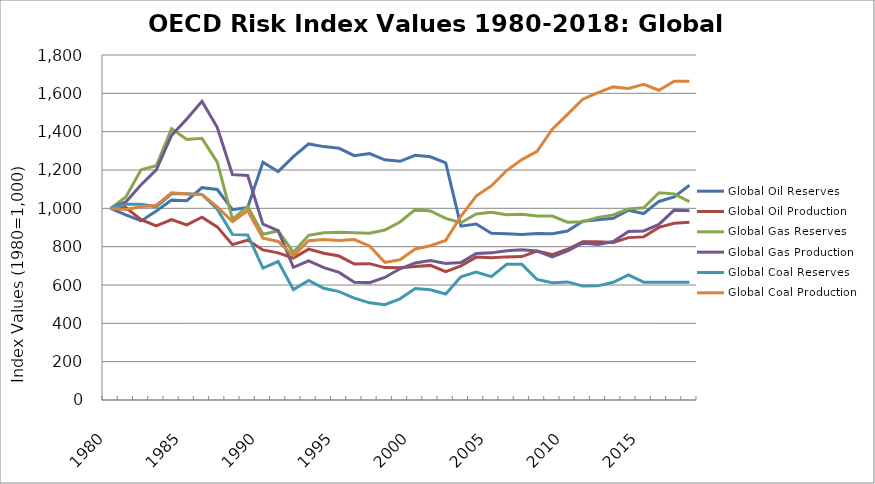
| Category | Global Oil Reserves | Global Oil Production | Global Gas Reserves | Global Gas Production | Global Coal Reserves | Global Coal Production |
|---|---|---|---|---|---|---|
| 1980.0 | 1000 | 1000 | 1000 | 1000 | 1000 | 1000 |
| 1981.0 | 965.465 | 1004.011 | 1059.522 | 1033.566 | 1021.331 | 994.49 |
| 1982.0 | 934.486 | 941.383 | 1201.635 | 1123.427 | 1021.331 | 1008.109 |
| 1983.0 | 985.373 | 908.717 | 1221.935 | 1200.305 | 1007.745 | 1016.284 |
| 1984.0 | 1043.55 | 941.789 | 1416.147 | 1380.237 | 1076.143 | 1081.565 |
| 1985.0 | 1040.004 | 913.824 | 1359.579 | 1465.555 | 1075.445 | 1074.426 |
| 1986.0 | 1107.889 | 953.785 | 1365.026 | 1557.963 | 1072.57 | 1071.979 |
| 1987.0 | 1098.24 | 903.145 | 1241.353 | 1422.864 | 995.882 | 1007.921 |
| 1988.0 | 992.666 | 810.519 | 944.158 | 1175.741 | 864.047 | 931.371 |
| 1989.0 | 1004.92 | 834.477 | 1009.152 | 1171.321 | 861.073 | 987.714 |
| 1990.0 | 1240.745 | 782.886 | 864.637 | 916.972 | 687.845 | 844.142 |
| 1991.0 | 1191.842 | 767.705 | 882.07 | 883.326 | 722.39 | 827.052 |
| 1992.0 | 1269.859 | 740.032 | 770.918 | 692.486 | 576.241 | 753.3 |
| 1993.0 | 1335.884 | 787.351 | 859.09 | 725.361 | 623.919 | 830.926 |
| 1994.0 | 1322.037 | 765.321 | 872.747 | 690.434 | 583.119 | 836.791 |
| 1995.0 | 1313.092 | 750.995 | 875.832 | 665.887 | 565.768 | 831.574 |
| 1996.0 | 1274.601 | 709.073 | 872.756 | 614.312 | 531.259 | 836.725 |
| 1997.0 | 1286.075 | 711.312 | 870.376 | 612.395 | 506.793 | 803.559 |
| 1998.0 | 1253.217 | 690.664 | 887.04 | 639.305 | 497.547 | 717.937 |
| 1999.0 | 1245.484 | 689.618 | 928.873 | 684.685 | 527.787 | 731.473 |
| 2000.0 | 1276.84 | 696.485 | 993.355 | 715.164 | 582.096 | 787.892 |
| 2001.0 | 1269.021 | 702.36 | 986.515 | 727.642 | 574.773 | 805.011 |
| 2002.0 | 1237.625 | 669.607 | 947.435 | 712.743 | 552.976 | 832.748 |
| 2003.0 | 906.84 | 699.325 | 924.915 | 717.417 | 643.121 | 958.629 |
| 2004.0 | 918.554 | 745.655 | 970.754 | 764.412 | 667.039 | 1064.311 |
| 2005.0 | 870.3 | 741.774 | 979.014 | 767.646 | 643.67 | 1117.678 |
| 2006.0 | 867.265 | 746.737 | 966.711 | 779.063 | 708.039 | 1197.207 |
| 2007.0 | 863.253 | 748.224 | 969.563 | 783.501 | 707.721 | 1254.018 |
| 2008.0 | 868.298 | 776.646 | 960.002 | 776.886 | 628.969 | 1297.494 |
| 2009.0 | 867.609 | 758.825 | 959.909 | 746.748 | 611.623 | 1413.074 |
| 2010.0 | 881.86 | 786.383 | 927.88 | 778.131 | 616.045 | 1490.192 |
| 2011.0 | 932.239 | 825.257 | 929.985 | 819.365 | 594.968 | 1569.388 |
| 2012.0 | 940.424 | 826.28 | 952.799 | 811.554 | 595.443 | 1604.046 |
| 2013.0 | 948.007 | 821.463 | 965.704 | 826.837 | 614.413 | 1633.622 |
| 2014.0 | 989.827 | 847.183 | 996.412 | 879.424 | 652.487 | 1624.986 |
| 2015.0 | 972.819 | 851.085 | 1003.128 | 882.324 | 614.862 | 1647.42 |
| 2016.0 | 1035.978 | 900.654 | 1081.465 | 916.215 | 614.862 | 1616.092 |
| 2017.0 | 1059.473 | 922.32 | 1075.532 | 990.775 | 614.862 | 1663.112 |
| 2018.0 | 1120.687 | 927.842 | 1034.643 | 987.714 | 614.862 | 1663.112 |